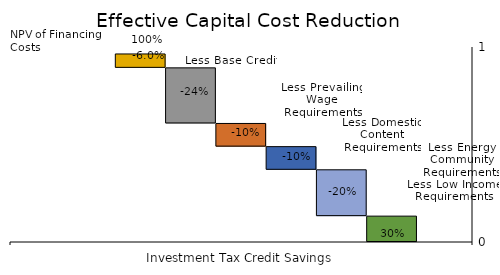
| Category | Effective NPV of Financing Costs | Less Low Income Requirements | Less Energy Community Requirements | Less Domestic Content Requirements | Less Prevailing Wage Requirements | Less Base Credit | NPV of Financing Costs |
|---|---|---|---|---|---|---|---|
| 0 | 132668.065 | 237600.799 | 118800.4 | 118800.4 | 285120.959 | 71280.24 | 0 |